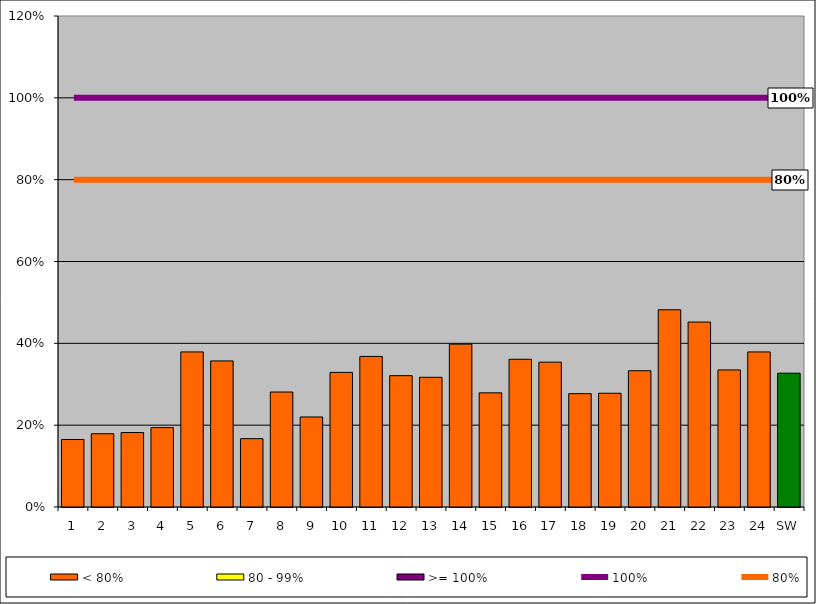
| Category | < 80% | 80 - 99% | >= 100% |
|---|---|---|---|
| 1 | 0.165 | 0 | 0 |
| 2 | 0.179 | 0 | 0 |
| 3 | 0.182 | 0 | 0 |
| 4 | 0.194 | 0 | 0 |
| 5 | 0.379 | 0 | 0 |
| 6 | 0.357 | 0 | 0 |
| 7 | 0.167 | 0 | 0 |
| 8 | 0.281 | 0 | 0 |
| 9 | 0.22 | 0 | 0 |
| 10 | 0.329 | 0 | 0 |
| 11 | 0.368 | 0 | 0 |
| 12 | 0.321 | 0 | 0 |
| 13 | 0.317 | 0 | 0 |
| 14 | 0.398 | 0 | 0 |
| 15 | 0.279 | 0 | 0 |
| 16 | 0.361 | 0 | 0 |
| 17 | 0.354 | 0 | 0 |
| 18 | 0.277 | 0 | 0 |
| 19 | 0.278 | 0 | 0 |
| 20 | 0.333 | 0 | 0 |
| 21 | 0.482 | 0 | 0 |
| 22 | 0.452 | 0 | 0 |
| 23 | 0.335 | 0 | 0 |
| 24 | 0.379 | 0 | 0 |
| SW | 0.327 | 0 | 0 |